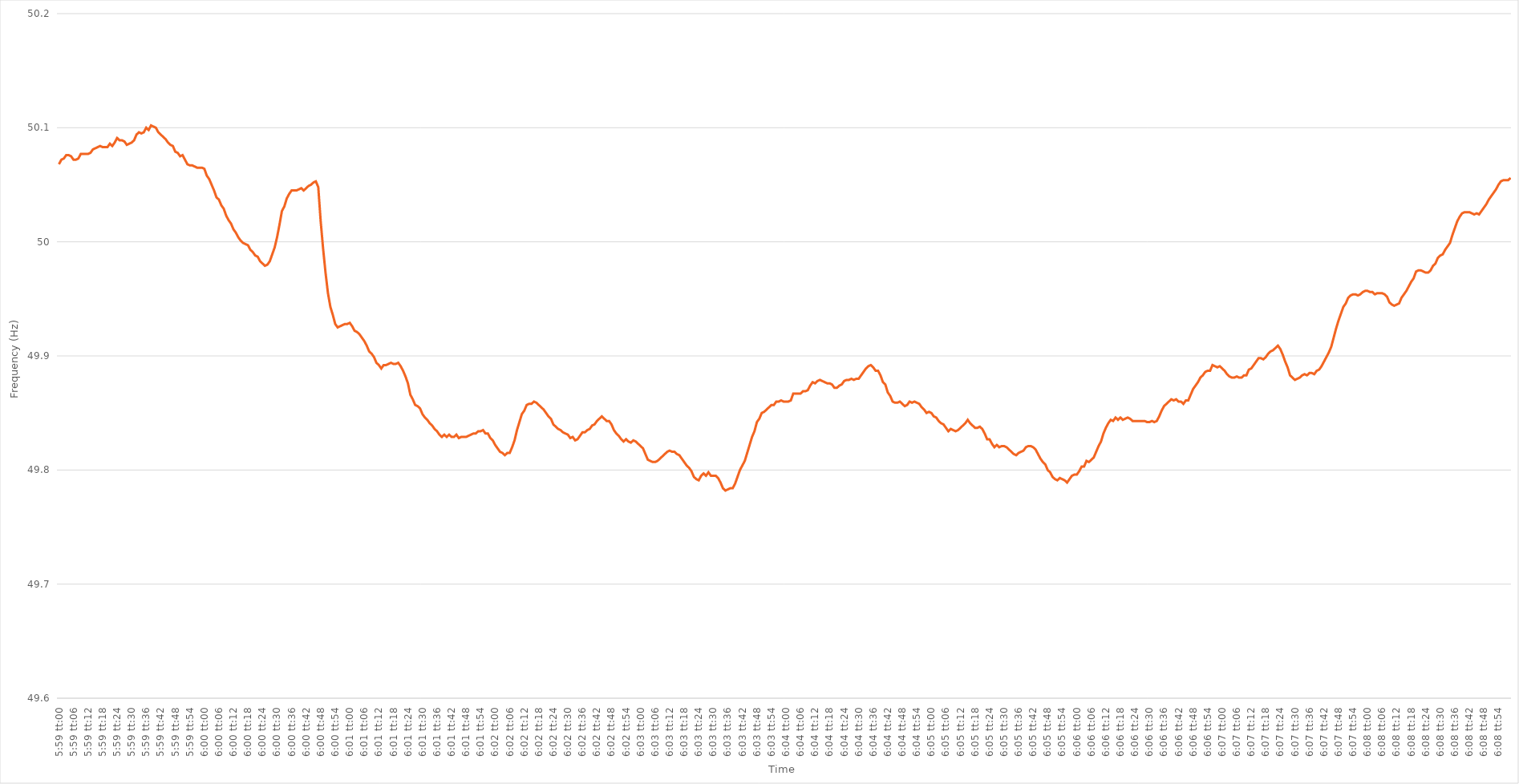
| Category | Series 0 |
|---|---|
| 0.24930555555555556 | 50.068 |
| 0.24931712962962962 | 50.072 |
| 0.24932870370370372 | 50.073 |
| 0.24934027777777779 | 50.076 |
| 0.24935185185185185 | 50.076 |
| 0.24936342592592595 | 50.075 |
| 0.249375 | 50.072 |
| 0.24938657407407408 | 50.072 |
| 0.24939814814814812 | 50.073 |
| 0.24940972222222224 | 50.077 |
| 0.24942129629629628 | 50.077 |
| 0.24943287037037035 | 50.077 |
| 0.24944444444444444 | 50.077 |
| 0.2494560185185185 | 50.078 |
| 0.24946759259259257 | 50.081 |
| 0.24947916666666667 | 50.082 |
| 0.24949074074074074 | 50.083 |
| 0.2495023148148148 | 50.084 |
| 0.2495138888888889 | 50.083 |
| 0.24952546296296296 | 50.083 |
| 0.24953703703703703 | 50.083 |
| 0.24954861111111112 | 50.086 |
| 0.2495601851851852 | 50.084 |
| 0.24957175925925926 | 50.087 |
| 0.24958333333333335 | 50.091 |
| 0.24959490740740742 | 50.089 |
| 0.24960648148148148 | 50.089 |
| 0.24961805555555558 | 50.088 |
| 0.24962962962962965 | 50.085 |
| 0.24964120370370368 | 50.086 |
| 0.2496527777777778 | 50.087 |
| 0.24966435185185185 | 50.089 |
| 0.2496759259259259 | 50.094 |
| 0.24968749999999998 | 50.096 |
| 0.24969907407407407 | 50.095 |
| 0.24971064814814814 | 50.096 |
| 0.2497222222222222 | 50.1 |
| 0.2497337962962963 | 50.098 |
| 0.24974537037037037 | 50.102 |
| 0.24975694444444443 | 50.101 |
| 0.24976851851851853 | 50.1 |
| 0.2497800925925926 | 50.096 |
| 0.24979166666666666 | 50.094 |
| 0.24980324074074076 | 50.092 |
| 0.24981481481481482 | 50.09 |
| 0.2498263888888889 | 50.087 |
| 0.24983796296296298 | 50.085 |
| 0.24984953703703705 | 50.084 |
| 0.2498611111111111 | 50.079 |
| 0.2498726851851852 | 50.078 |
| 0.24988425925925925 | 50.075 |
| 0.24989583333333334 | 50.076 |
| 0.24990740740740738 | 50.072 |
| 0.24991898148148148 | 50.068 |
| 0.24993055555555554 | 50.067 |
| 0.2499421296296296 | 50.067 |
| 0.2499537037037037 | 50.066 |
| 0.24996527777777777 | 50.065 |
| 0.24997685185185184 | 50.065 |
| 0.24998842592592593 | 50.065 |
| 0.25 | 50.064 |
| 0.2500115740740741 | 50.058 |
| 0.25002314814814813 | 50.055 |
| 0.2500347222222222 | 50.05 |
| 0.2500462962962963 | 50.045 |
| 0.25005787037037036 | 50.039 |
| 0.25006944444444446 | 50.037 |
| 0.25008101851851855 | 50.032 |
| 0.2500925925925926 | 50.029 |
| 0.2501041666666667 | 50.023 |
| 0.2501157407407408 | 50.019 |
| 0.2501273148148148 | 50.016 |
| 0.25013888888888886 | 50.011 |
| 0.25015046296296295 | 50.008 |
| 0.25016203703703704 | 50.004 |
| 0.2501736111111111 | 50.001 |
| 0.2501851851851852 | 49.999 |
| 0.25019675925925927 | 49.998 |
| 0.2502083333333333 | 49.997 |
| 0.2502199074074074 | 49.993 |
| 0.2502314814814815 | 49.991 |
| 0.25024305555555554 | 49.988 |
| 0.25025462962962963 | 49.987 |
| 0.2502662037037037 | 49.983 |
| 0.25027777777777777 | 49.981 |
| 0.25028935185185186 | 49.979 |
| 0.25030092592592595 | 49.98 |
| 0.2503125 | 49.983 |
| 0.2503240740740741 | 49.989 |
| 0.2503356481481482 | 49.995 |
| 0.2503472222222222 | 50.004 |
| 0.25035879629629626 | 50.015 |
| 0.25037037037037035 | 50.027 |
| 0.25038194444444445 | 50.031 |
| 0.2503935185185185 | 50.038 |
| 0.2504050925925926 | 50.042 |
| 0.2504166666666667 | 50.045 |
| 0.2504282407407407 | 50.045 |
| 0.2504398148148148 | 50.045 |
| 0.2504513888888889 | 50.046 |
| 0.25046296296296294 | 50.047 |
| 0.25047453703703704 | 50.045 |
| 0.25048611111111113 | 50.047 |
| 0.25049768518518517 | 50.049 |
| 0.25050925925925926 | 50.05 |
| 0.25052083333333336 | 50.052 |
| 0.2505324074074074 | 50.053 |
| 0.2505439814814815 | 50.048 |
| 0.2505555555555556 | 50.018 |
| 0.2505671296296296 | 49.994 |
| 0.2505787037037037 | 49.973 |
| 0.2505902777777778 | 49.955 |
| 0.25060185185185185 | 49.943 |
| 0.2506134259259259 | 49.936 |
| 0.250625 | 49.928 |
| 0.2506365740740741 | 49.925 |
| 0.2506481481481481 | 49.926 |
| 0.2506597222222222 | 49.927 |
| 0.2506712962962963 | 49.928 |
| 0.25068287037037035 | 49.928 |
| 0.25069444444444444 | 49.929 |
| 0.25070601851851854 | 49.926 |
| 0.2507175925925926 | 49.922 |
| 0.25072916666666667 | 49.921 |
| 0.25074074074074076 | 49.919 |
| 0.2507523148148148 | 49.916 |
| 0.2507638888888889 | 49.913 |
| 0.250775462962963 | 49.909 |
| 0.25078703703703703 | 49.904 |
| 0.2507986111111111 | 49.902 |
| 0.2508101851851852 | 49.899 |
| 0.25082175925925926 | 49.894 |
| 0.2508333333333333 | 49.892 |
| 0.2508449074074074 | 49.889 |
| 0.2508564814814815 | 49.892 |
| 0.2508680555555555 | 49.892 |
| 0.2508796296296296 | 49.893 |
| 0.2508912037037037 | 49.894 |
| 0.25090277777777775 | 49.893 |
| 0.25091435185185185 | 49.893 |
| 0.25092592592592594 | 49.894 |
| 0.2509375 | 49.891 |
| 0.2509490740740741 | 49.887 |
| 0.25096064814814817 | 49.882 |
| 0.2509722222222222 | 49.876 |
| 0.2509837962962963 | 49.866 |
| 0.2509953703703704 | 49.862 |
| 0.25100694444444444 | 49.857 |
| 0.25101851851851853 | 49.856 |
| 0.2510300925925926 | 49.854 |
| 0.25104166666666666 | 49.849 |
| 0.25105324074074076 | 49.846 |
| 0.25106481481481485 | 49.844 |
| 0.2510763888888889 | 49.841 |
| 0.25108796296296293 | 49.839 |
| 0.251099537037037 | 49.836 |
| 0.2511111111111111 | 49.834 |
| 0.25112268518518516 | 49.831 |
| 0.25113425925925925 | 49.829 |
| 0.25114583333333335 | 49.831 |
| 0.2511574074074074 | 49.829 |
| 0.2511689814814815 | 49.831 |
| 0.2511805555555556 | 49.829 |
| 0.2511921296296296 | 49.829 |
| 0.2512037037037037 | 49.831 |
| 0.2512152777777778 | 49.828 |
| 0.25122685185185184 | 49.829 |
| 0.25123842592592593 | 49.829 |
| 0.25125000000000003 | 49.829 |
| 0.25126157407407407 | 49.83 |
| 0.25127314814814816 | 49.831 |
| 0.25128472222222226 | 49.832 |
| 0.2512962962962963 | 49.832 |
| 0.25130787037037033 | 49.834 |
| 0.25131944444444443 | 49.834 |
| 0.2513310185185185 | 49.835 |
| 0.25134259259259256 | 49.832 |
| 0.25135416666666666 | 49.832 |
| 0.25136574074074075 | 49.828 |
| 0.2513773148148148 | 49.826 |
| 0.2513888888888889 | 49.822 |
| 0.251400462962963 | 49.819 |
| 0.251412037037037 | 49.816 |
| 0.2514236111111111 | 49.815 |
| 0.2514351851851852 | 49.813 |
| 0.25144675925925924 | 49.815 |
| 0.25145833333333334 | 49.815 |
| 0.25146990740740743 | 49.82 |
| 0.2514814814814815 | 49.826 |
| 0.25149305555555557 | 49.835 |
| 0.25150462962962966 | 49.842 |
| 0.2515162037037037 | 49.849 |
| 0.2515277777777778 | 49.852 |
| 0.25153935185185183 | 49.857 |
| 0.25155092592592593 | 49.858 |
| 0.25156249999999997 | 49.858 |
| 0.25157407407407406 | 49.86 |
| 0.25158564814814816 | 49.859 |
| 0.2515972222222222 | 49.857 |
| 0.2516087962962963 | 49.855 |
| 0.2516203703703704 | 49.853 |
| 0.2516319444444444 | 49.85 |
| 0.2516435185185185 | 49.847 |
| 0.2516550925925926 | 49.845 |
| 0.25166666666666665 | 49.84 |
| 0.25167824074074074 | 49.838 |
| 0.25168981481481484 | 49.836 |
| 0.2517013888888889 | 49.835 |
| 0.25171296296296297 | 49.833 |
| 0.25172453703703707 | 49.832 |
| 0.2517361111111111 | 49.831 |
| 0.2517476851851852 | 49.828 |
| 0.2517592592592593 | 49.829 |
| 0.25177083333333333 | 49.826 |
| 0.25178240740740737 | 49.827 |
| 0.25179398148148147 | 49.83 |
| 0.25180555555555556 | 49.833 |
| 0.2518171296296296 | 49.833 |
| 0.2518287037037037 | 49.835 |
| 0.2518402777777778 | 49.836 |
| 0.2518518518518518 | 49.839 |
| 0.2518634259259259 | 49.84 |
| 0.251875 | 49.843 |
| 0.25188657407407405 | 49.845 |
| 0.25189814814814815 | 49.847 |
| 0.25190972222222224 | 49.845 |
| 0.2519212962962963 | 49.843 |
| 0.2519328703703704 | 49.843 |
| 0.25194444444444447 | 49.84 |
| 0.2519560185185185 | 49.835 |
| 0.2519675925925926 | 49.832 |
| 0.2519791666666667 | 49.83 |
| 0.25199074074074074 | 49.827 |
| 0.25200231481481483 | 49.825 |
| 0.25201388888888887 | 49.827 |
| 0.25202546296296297 | 49.825 |
| 0.252037037037037 | 49.824 |
| 0.2520486111111111 | 49.826 |
| 0.2520601851851852 | 49.825 |
| 0.25207175925925923 | 49.823 |
| 0.2520833333333333 | 49.821 |
| 0.2520949074074074 | 49.819 |
| 0.25210648148148146 | 49.814 |
| 0.25211805555555555 | 49.809 |
| 0.25212962962962965 | 49.808 |
| 0.2521412037037037 | 49.807 |
| 0.2521527777777778 | 49.807 |
| 0.2521643518518519 | 49.808 |
| 0.2521759259259259 | 49.81 |
| 0.2521875 | 49.812 |
| 0.2521990740740741 | 49.814 |
| 0.25221064814814814 | 49.816 |
| 0.25222222222222224 | 49.817 |
| 0.25223379629629633 | 49.816 |
| 0.25224537037037037 | 49.816 |
| 0.2522569444444444 | 49.814 |
| 0.2522685185185185 | 49.813 |
| 0.2522800925925926 | 49.81 |
| 0.25229166666666664 | 49.807 |
| 0.25230324074074073 | 49.804 |
| 0.2523148148148148 | 49.802 |
| 0.25232638888888886 | 49.799 |
| 0.25233796296296296 | 49.794 |
| 0.25234953703703705 | 49.792 |
| 0.2523611111111111 | 49.791 |
| 0.2523726851851852 | 49.795 |
| 0.2523842592592593 | 49.797 |
| 0.2523958333333333 | 49.795 |
| 0.2524074074074074 | 49.798 |
| 0.2524189814814815 | 49.795 |
| 0.25243055555555555 | 49.795 |
| 0.25244212962962964 | 49.795 |
| 0.25245370370370374 | 49.793 |
| 0.2524652777777778 | 49.789 |
| 0.25247685185185187 | 49.784 |
| 0.2524884259259259 | 49.782 |
| 0.2525 | 49.783 |
| 0.25251157407407404 | 49.784 |
| 0.25252314814814814 | 49.784 |
| 0.25253472222222223 | 49.788 |
| 0.25254629629629627 | 49.794 |
| 0.25255787037037036 | 49.8 |
| 0.25256944444444446 | 49.804 |
| 0.2525810185185185 | 49.808 |
| 0.2525925925925926 | 49.815 |
| 0.2526041666666667 | 49.822 |
| 0.2526157407407407 | 49.829 |
| 0.2526273148148148 | 49.834 |
| 0.2526388888888889 | 49.842 |
| 0.25265046296296295 | 49.845 |
| 0.25266203703703705 | 49.85 |
| 0.25267361111111114 | 49.851 |
| 0.2526851851851852 | 49.853 |
| 0.2526967592592593 | 49.855 |
| 0.25270833333333337 | 49.857 |
| 0.2527199074074074 | 49.857 |
| 0.25273148148148145 | 49.86 |
| 0.25274305555555554 | 49.86 |
| 0.25275462962962963 | 49.861 |
| 0.2527662037037037 | 49.86 |
| 0.25277777777777777 | 49.86 |
| 0.25278935185185186 | 49.86 |
| 0.2528009259259259 | 49.861 |
| 0.2528125 | 49.867 |
| 0.2528240740740741 | 49.867 |
| 0.25283564814814813 | 49.867 |
| 0.2528472222222222 | 49.867 |
| 0.2528587962962963 | 49.869 |
| 0.25287037037037036 | 49.869 |
| 0.25288194444444445 | 49.87 |
| 0.25289351851851855 | 49.874 |
| 0.2529050925925926 | 49.877 |
| 0.2529166666666667 | 49.876 |
| 0.2529282407407408 | 49.878 |
| 0.2529398148148148 | 49.879 |
| 0.2529513888888889 | 49.878 |
| 0.25296296296296295 | 49.877 |
| 0.25297453703703704 | 49.876 |
| 0.2529861111111111 | 49.876 |
| 0.2529976851851852 | 49.875 |
| 0.25300925925925927 | 49.872 |
| 0.2530208333333333 | 49.872 |
| 0.2530324074074074 | 49.874 |
| 0.2530439814814815 | 49.875 |
| 0.25305555555555553 | 49.878 |
| 0.25306712962962963 | 49.879 |
| 0.2530787037037037 | 49.879 |
| 0.25309027777777776 | 49.88 |
| 0.25310185185185186 | 49.879 |
| 0.25311342592592595 | 49.88 |
| 0.253125 | 49.88 |
| 0.2531365740740741 | 49.883 |
| 0.2531481481481482 | 49.886 |
| 0.2531597222222222 | 49.889 |
| 0.2531712962962963 | 49.891 |
| 0.2531828703703704 | 49.892 |
| 0.25319444444444444 | 49.89 |
| 0.2532060185185185 | 49.887 |
| 0.2532175925925926 | 49.887 |
| 0.25322916666666667 | 49.883 |
| 0.2532407407407407 | 49.877 |
| 0.2532523148148148 | 49.875 |
| 0.2532638888888889 | 49.868 |
| 0.25327546296296294 | 49.865 |
| 0.25328703703703703 | 49.86 |
| 0.2532986111111111 | 49.859 |
| 0.25331018518518517 | 49.859 |
| 0.25332175925925926 | 49.86 |
| 0.25333333333333335 | 49.858 |
| 0.2533449074074074 | 49.856 |
| 0.2533564814814815 | 49.857 |
| 0.2533680555555556 | 49.86 |
| 0.2533796296296296 | 49.859 |
| 0.2533912037037037 | 49.86 |
| 0.2534027777777778 | 49.859 |
| 0.25341435185185185 | 49.858 |
| 0.25342592592592594 | 49.855 |
| 0.2534375 | 49.853 |
| 0.2534490740740741 | 49.85 |
| 0.2534606481481481 | 49.851 |
| 0.2534722222222222 | 49.85 |
| 0.2534837962962963 | 49.847 |
| 0.25349537037037034 | 49.846 |
| 0.25350694444444444 | 49.843 |
| 0.25351851851851853 | 49.841 |
| 0.25353009259259257 | 49.84 |
| 0.25354166666666667 | 49.837 |
| 0.25355324074074076 | 49.834 |
| 0.2535648148148148 | 49.836 |
| 0.2535763888888889 | 49.835 |
| 0.253587962962963 | 49.834 |
| 0.253599537037037 | 49.835 |
| 0.2536111111111111 | 49.837 |
| 0.2536226851851852 | 49.839 |
| 0.25363425925925925 | 49.841 |
| 0.25364583333333335 | 49.844 |
| 0.25365740740740744 | 49.841 |
| 0.2536689814814815 | 49.839 |
| 0.2536805555555555 | 49.837 |
| 0.2536921296296296 | 49.837 |
| 0.2537037037037037 | 49.838 |
| 0.25371527777777775 | 49.836 |
| 0.25372685185185184 | 49.832 |
| 0.25373842592592594 | 49.827 |
| 0.25375 | 49.827 |
| 0.25376157407407407 | 49.823 |
| 0.25377314814814816 | 49.82 |
| 0.2537847222222222 | 49.822 |
| 0.2537962962962963 | 49.82 |
| 0.2538078703703704 | 49.821 |
| 0.25381944444444443 | 49.821 |
| 0.2538310185185185 | 49.82 |
| 0.2538425925925926 | 49.818 |
| 0.25385416666666666 | 49.816 |
| 0.25386574074074075 | 49.814 |
| 0.25387731481481485 | 49.813 |
| 0.2538888888888889 | 49.815 |
| 0.253900462962963 | 49.816 |
| 0.253912037037037 | 49.817 |
| 0.2539236111111111 | 49.82 |
| 0.25393518518518515 | 49.821 |
| 0.25394675925925925 | 49.821 |
| 0.25395833333333334 | 49.82 |
| 0.2539699074074074 | 49.818 |
| 0.2539814814814815 | 49.814 |
| 0.25399305555555557 | 49.81 |
| 0.2540046296296296 | 49.807 |
| 0.2540162037037037 | 49.805 |
| 0.2540277777777778 | 49.8 |
| 0.25403935185185184 | 49.798 |
| 0.25405092592592593 | 49.794 |
| 0.2540625 | 49.792 |
| 0.25407407407407406 | 49.791 |
| 0.25408564814814816 | 49.793 |
| 0.25409722222222225 | 49.792 |
| 0.2541087962962963 | 49.791 |
| 0.2541203703703704 | 49.789 |
| 0.2541319444444445 | 49.792 |
| 0.2541435185185185 | 49.795 |
| 0.25415509259259256 | 49.796 |
| 0.25416666666666665 | 49.796 |
| 0.25417824074074075 | 49.799 |
| 0.2541898148148148 | 49.803 |
| 0.2542013888888889 | 49.803 |
| 0.254212962962963 | 49.808 |
| 0.254224537037037 | 49.807 |
| 0.2542361111111111 | 49.809 |
| 0.2542476851851852 | 49.811 |
| 0.25425925925925924 | 49.816 |
| 0.25427083333333333 | 49.821 |
| 0.25428240740740743 | 49.825 |
| 0.25429398148148147 | 49.832 |
| 0.25430555555555556 | 49.837 |
| 0.25431712962962966 | 49.841 |
| 0.2543287037037037 | 49.844 |
| 0.2543402777777778 | 49.843 |
| 0.2543518518518519 | 49.846 |
| 0.2543634259259259 | 49.844 |
| 0.254375 | 49.846 |
| 0.25438657407407406 | 49.844 |
| 0.25439814814814815 | 49.845 |
| 0.2544097222222222 | 49.846 |
| 0.2544212962962963 | 49.845 |
| 0.2544328703703704 | 49.843 |
| 0.2544444444444444 | 49.843 |
| 0.2544560185185185 | 49.843 |
| 0.2544675925925926 | 49.843 |
| 0.25447916666666665 | 49.843 |
| 0.25449074074074074 | 49.843 |
| 0.25450231481481483 | 49.842 |
| 0.2545138888888889 | 49.842 |
| 0.25452546296296297 | 49.843 |
| 0.25453703703703706 | 49.842 |
| 0.2545486111111111 | 49.843 |
| 0.2545601851851852 | 49.847 |
| 0.2545717592592593 | 49.852 |
| 0.25458333333333333 | 49.856 |
| 0.2545949074074074 | 49.858 |
| 0.2546064814814815 | 49.86 |
| 0.25461805555555556 | 49.862 |
| 0.2546296296296296 | 49.861 |
| 0.2546412037037037 | 49.862 |
| 0.2546527777777778 | 49.86 |
| 0.2546643518518518 | 49.86 |
| 0.2546759259259259 | 49.858 |
| 0.2546875 | 49.861 |
| 0.25469907407407405 | 49.861 |
| 0.25471064814814814 | 49.866 |
| 0.25472222222222224 | 49.871 |
| 0.2547337962962963 | 49.874 |
| 0.25474537037037037 | 49.877 |
| 0.25475694444444447 | 49.881 |
| 0.2547685185185185 | 49.883 |
| 0.2547800925925926 | 49.886 |
| 0.2547916666666667 | 49.887 |
| 0.25480324074074073 | 49.887 |
| 0.2548148148148148 | 49.892 |
| 0.2548263888888889 | 49.891 |
| 0.25483796296296296 | 49.89 |
| 0.25484953703703705 | 49.891 |
| 0.2548611111111111 | 49.889 |
| 0.2548726851851852 | 49.887 |
| 0.2548842592592592 | 49.884 |
| 0.2548958333333333 | 49.882 |
| 0.2549074074074074 | 49.881 |
| 0.25491898148148145 | 49.881 |
| 0.25493055555555555 | 49.882 |
| 0.25494212962962964 | 49.881 |
| 0.2549537037037037 | 49.881 |
| 0.2549652777777778 | 49.883 |
| 0.25497685185185187 | 49.883 |
| 0.2549884259259259 | 49.888 |
| 0.255 | 49.889 |
| 0.2550115740740741 | 49.892 |
| 0.25502314814814814 | 49.895 |
| 0.25503472222222223 | 49.898 |
| 0.2550462962962963 | 49.898 |
| 0.25505787037037037 | 49.897 |
| 0.25506944444444446 | 49.899 |
| 0.25508101851851855 | 49.902 |
| 0.2550925925925926 | 49.904 |
| 0.25510416666666663 | 49.905 |
| 0.2551157407407407 | 49.907 |
| 0.2551273148148148 | 49.909 |
| 0.25513888888888886 | 49.906 |
| 0.25515046296296295 | 49.901 |
| 0.25516203703703705 | 49.895 |
| 0.2551736111111111 | 49.89 |
| 0.2551851851851852 | 49.883 |
| 0.2551967592592593 | 49.881 |
| 0.2552083333333333 | 49.879 |
| 0.2552199074074074 | 49.88 |
| 0.2552314814814815 | 49.881 |
| 0.25524305555555554 | 49.883 |
| 0.25525462962962964 | 49.884 |
| 0.25526620370370373 | 49.883 |
| 0.25527777777777777 | 49.885 |
| 0.25528935185185186 | 49.885 |
| 0.25530092592592596 | 49.884 |
| 0.2553125 | 49.887 |
| 0.2553240740740741 | 49.888 |
| 0.25533564814814813 | 49.891 |
| 0.2553472222222222 | 49.895 |
| 0.25535879629629626 | 49.899 |
| 0.25537037037037036 | 49.903 |
| 0.25538194444444445 | 49.908 |
| 0.2553935185185185 | 49.916 |
| 0.2554050925925926 | 49.924 |
| 0.2554166666666667 | 49.931 |
| 0.2554282407407407 | 49.937 |
| 0.2554398148148148 | 49.943 |
| 0.2554513888888889 | 49.946 |
| 0.25546296296296295 | 49.951 |
| 0.25547453703703704 | 49.953 |
| 0.25548611111111114 | 49.954 |
| 0.2554976851851852 | 49.954 |
| 0.25550925925925927 | 49.953 |
| 0.25552083333333336 | 49.954 |
| 0.2555324074074074 | 49.956 |
| 0.2555439814814815 | 49.957 |
| 0.2555555555555556 | 49.957 |
| 0.25556712962962963 | 49.956 |
| 0.25557870370370367 | 49.956 |
| 0.25559027777777776 | 49.954 |
| 0.25560185185185186 | 49.955 |
| 0.2556134259259259 | 49.955 |
| 0.255625 | 49.955 |
| 0.2556365740740741 | 49.954 |
| 0.2556481481481481 | 49.952 |
| 0.2556597222222222 | 49.947 |
| 0.2556712962962963 | 49.945 |
| 0.25568287037037035 | 49.944 |
| 0.25569444444444445 | 49.945 |
| 0.25570601851851854 | 49.946 |
| 0.2557175925925926 | 49.951 |
| 0.2557291666666667 | 49.954 |
| 0.25574074074074077 | 49.957 |
| 0.2557523148148148 | 49.961 |
| 0.2557638888888889 | 49.965 |
| 0.255775462962963 | 49.968 |
| 0.25578703703703703 | 49.974 |
| 0.2557986111111111 | 49.975 |
| 0.25581018518518517 | 49.975 |
| 0.25582175925925926 | 49.974 |
| 0.2558333333333333 | 49.973 |
| 0.2558449074074074 | 49.973 |
| 0.2558564814814815 | 49.975 |
| 0.25586805555555553 | 49.979 |
| 0.2558796296296296 | 49.981 |
| 0.2558912037037037 | 49.986 |
| 0.25590277777777776 | 49.988 |
| 0.25591435185185185 | 49.989 |
| 0.25592592592592595 | 49.993 |
| 0.2559375 | 49.996 |
| 0.2559490740740741 | 49.999 |
| 0.2559606481481482 | 50.006 |
| 0.2559722222222222 | 50.012 |
| 0.2559837962962963 | 50.018 |
| 0.2559953703703704 | 50.022 |
| 0.25600694444444444 | 50.025 |
| 0.25601851851851853 | 50.026 |
| 0.25603009259259263 | 50.026 |
| 0.25604166666666667 | 50.026 |
| 0.2560532407407407 | 50.025 |
| 0.2560648148148148 | 50.024 |
| 0.2560763888888889 | 50.025 |
| 0.25608796296296293 | 50.024 |
| 0.25609953703703703 | 50.027 |
| 0.2561111111111111 | 50.03 |
| 0.25612268518518516 | 50.033 |
| 0.25613425925925926 | 50.037 |
| 0.25614583333333335 | 50.04 |
| 0.2561574074074074 | 50.043 |
| 0.2561689814814815 | 50.046 |
| 0.2561805555555556 | 50.05 |
| 0.2561921296296296 | 50.053 |
| 0.2562037037037037 | 50.054 |
| 0.2562152777777778 | 50.054 |
| 0.25622685185185184 | 50.054 |
| 0.25623842592592594 | 50.056 |